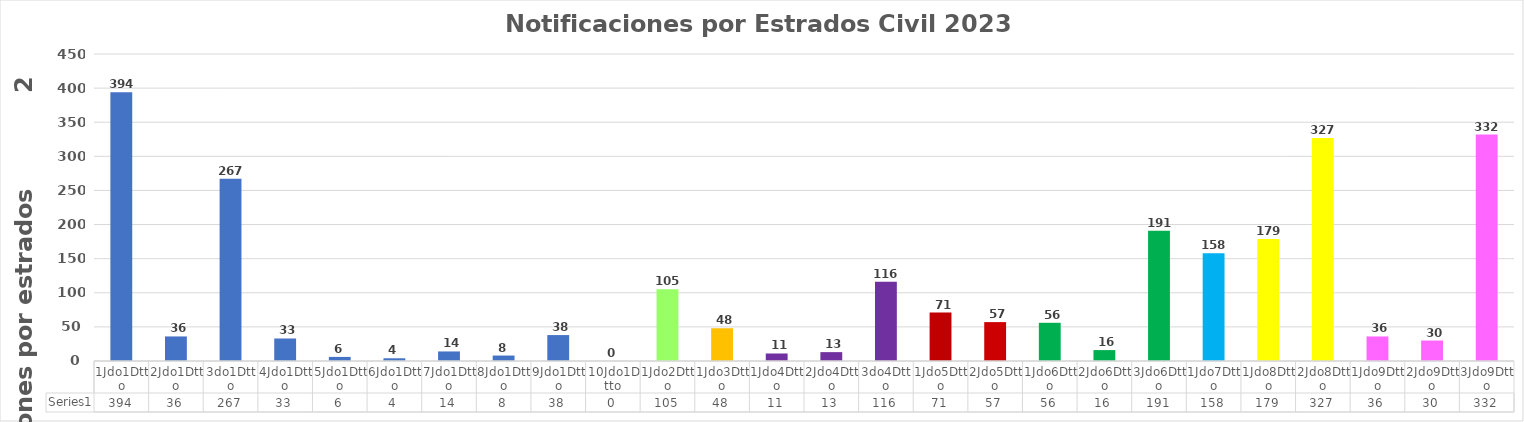
| Category | Series 0 |
|---|---|
| 1Jdo1Dtto | 394 |
| 2Jdo1Dtto | 36 |
| 3do1Dtto | 267 |
| 4Jdo1Dtto | 33 |
| 5Jdo1Dtto | 6 |
| 6Jdo1Dtto | 4 |
| 7Jdo1Dtto | 14 |
| 8Jdo1Dtto | 8 |
| 9Jdo1Dtto | 38 |
| 10Jdo1Dtto | 0 |
| 1Jdo2Dtto | 105 |
| 1Jdo3Dtto | 48 |
| 1Jdo4Dtto | 11 |
| 2Jdo4Dtto | 13 |
| 3do4Dtto | 116 |
| 1Jdo5Dtto | 71 |
| 2Jdo5Dtto | 57 |
| 1Jdo6Dtto | 56 |
| 2Jdo6Dtto | 16 |
| 3Jdo6Dtto | 191 |
| 1Jdo7Dtto | 158 |
| 1Jdo8Dtto | 179 |
| 2Jdo8Dtto | 327 |
| 1Jdo9Dtto | 36 |
| 2Jdo9Dtto | 30 |
| 3Jdo9Dtto | 332 |